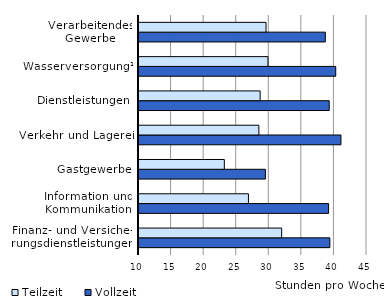
| Category | Vollzeit | Teilzeit |
|---|---|---|
| Finanz- und Versiche-
rungsdienstleistungen | 39.3 | 31.9 |
| Information und Kommunikation | 39.1 | 26.8 |
| Gastgewerbe | 29.4 | 23.1 |
| Verkehr und Lagerei | 41 | 28.4 |
| Dienstleistungen | 39.2 | 28.6 |
| Wasserversorgung¹ | 40.2 | 29.8 |
| Verarbeitendes Gewerbe | 38.6 | 29.5 |